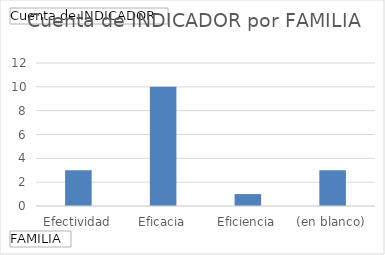
| Category | Total |
|---|---|
| Efectividad | 3 |
| Eficacia | 10 |
| Eficiencia | 1 |
| (en blanco) | 3 |